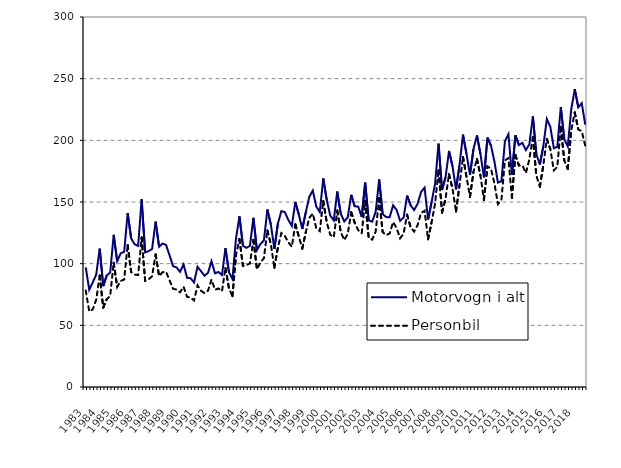
| Category | Motorvogn i alt | Personbil |
|---|---|---|
| 1983.0 | 97 | 78.3 |
| nan | 78.8 | 61.3 |
| nan | 84.8 | 63 |
| nan | 91.2 | 70.8 |
| 1984.0 | 112.2 | 90.4 |
| nan | 81.8 | 64.4 |
| nan | 90.4 | 71.1 |
| nan | 92.9 | 73.9 |
| 1985.0 | 123.4 | 100.8 |
| nan | 102 | 81.1 |
| nan | 108.4 | 86 |
| nan | 109.6 | 87.1 |
| 1986.0 | 141 | 115.2 |
| nan | 120.5 | 93.2 |
| nan | 115.7 | 91.1 |
| nan | 114.4 | 90.8 |
| 1987.0 | 152.2 | 121.3 |
| nan | 109.2 | 86.1 |
| nan | 110.1 | 87.3 |
| nan | 112 | 89.8 |
| 1988.0 | 134.1 | 107.5 |
| nan | 113.7 | 90 |
| nan | 116.3 | 93.1 |
| nan | 115.2 | 93.4 |
| 1989.0 | 106.6 | 86.4 |
| nan | 98 | 79.6 |
| nan | 96.9 | 79 |
| nan | 93.4 | 76.8 |
| 1990.0 | 99.4 | 81.3 |
| nan | 88.6 | 73.1 |
| nan | 88.2 | 72.5 |
| nan | 84.8 | 70.2 |
| 1991.0 | 97.5 | 82.4 |
| nan | 93.9 | 78 |
| nan | 90.2 | 76.1 |
| nan | 92.6 | 78.1 |
| 1992.0 | 102 | 87.1 |
| nan | 92.2 | 78.9 |
| nan | 93.3 | 79.9 |
| nan | 90.8 | 77.6 |
| 1993.0 | 112.6 | 96.5 |
| nan | 93 | 80.1 |
| nan | 87.5 | 73.6 |
| nan | 120.1 | 106.6 |
| 1994.0 | 138.4 | 120 |
| nan | 114.5 | 98.1 |
| nan | 112.8 | 98.8 |
| nan | 114.5 | 100.2 |
| 1995.0 | 137.2 | 119.3 |
| nan | 111 | 95.4 |
| nan | 115.9 | 101 |
| nan | 118.8 | 104.4 |
| 1996.0 | 143.9 | 126.9 |
| nan | 131.6 | 115.7 |
| nan | 112 | 96.7 |
| nan | 132.5 | 113.1 |
| 1997.0 | 142.6 | 124.8 |
| nan | 141.8 | 122.5 |
| nan | 135.4 | 117.3 |
| nan | 130.6 | 113.7 |
| 1998.0 | 150 | 131.9 |
| nan | 139.8 | 122 |
| nan | 128.1 | 112.1 |
| nan | 141.8 | 125.6 |
| 1999.0 | 154.2 | 137.1 |
| nan | 159.3 | 140.7 |
| nan | 146.3 | 128.7 |
| nan | 141.9 | 126.4 |
| 2000.0 | 169.1 | 150.9 |
| nan | 151.5 | 133.4 |
| nan | 139 | 123.5 |
| nan | 135.1 | 121.4 |
| 2001.0 | 158.5 | 143.1 |
| nan | 140.46 | 125.7 |
| nan | 134.24 | 119.2 |
| nan | 137.495 | 124.072 |
| 2002.0 | 155.814 | 141.724 |
| nan | 146.543 | 133.19 |
| nan | 146.231 | 127.141 |
| nan | 137.967 | 124.641 |
| 2003.0 | 165.679 | 150.811 |
| nan | 135.021 | 121.101 |
| nan | 134.111 | 119.491 |
| nan | 142.013 | 125.959 |
| 2004.0 | 168.309 | 153.043 |
| nan | 140.267 | 125.568 |
| nan | 137.77 | 123.121 |
| nan | 137.685 | 124.506 |
| 2005.0 | 147.311 | 133.756 |
| nan | 143.517 | 128.79 |
| nan | 134.783 | 120.571 |
| nan | 137.37 | 124.382 |
| 2006.0 | 155.213 | 139.728 |
| nan | 147.444 | 129.572 |
| nan | 143.451 | 126.006 |
| nan | 148.561 | 131.195 |
| 2007.0 | 158.1 | 141.084 |
| nan | 161.613 | 142.897 |
| nan | 135.821 | 119.753 |
| nan | 149.791 | 133.498 |
| 2008.0 | 164.642 | 148.614 |
| nan | 197.287 | 175.714 |
| nan | 159.718 | 141.407 |
| nan | 170.057 | 152.54 |
| 2009.0 | 191.38 | 172.559 |
| nan | 178.906 | 160.765 |
| nan | 160.234 | 142.312 |
| nan | 179.857 | 163.532 |
| 2010.0 | 204.636 | 186.507 |
| nan | 188.957 | 170.463 |
| nan | 172.077 | 154.156 |
| nan | 192.961 | 174.399 |
| 2011.0 | 204.005 | 184.86 |
| nan | 188.741 | 171.333 |
| nan | 169.934 | 151.694 |
| nan | 202.176 | 178.919 |
| 2012.0 | 195.829 | 177.072 |
| nan | 182.751 | 165.128 |
| nan | 165.73 | 148.242 |
| nan | 166.805 | 151.728 |
| 2013.0 | 199.181 | 183.653 |
| nan | 205.015 | 185.634 |
| nan | 172.044 | 153.21 |
| nan | 204.1 | 188.079 |
| 2014.0 | 196.177 | 179.552 |
| nan | 197.965 | 179.767 |
| nan | 192.105 | 173.474 |
| nan | 196.809 | 184.739 |
| 2015.0 | 219.419 | 202.592 |
| nan | 188.696 | 171.451 |
| nan | 180.388 | 162.297 |
| nan | 195.23 | 179.891 |
| 2016.0 | 217.298 | 201.197 |
| nan | 210.949 | 192.893 |
| nan | 193.648 | 175.642 |
| nan | 194.663 | 178.455 |
| 2017.0 | 227.029 | 210.738 |
| nan | 200.767 | 183.708 |
| nan | 195.059 | 176.766 |
| nan | 225.423 | 208.218 |
| 2018.0 | 241.528 | 222.678 |
| nan | 226.771 | 208.839 |
| nan | 230.044 | 207.395 |
| nan | 212.667 | 195.666 |